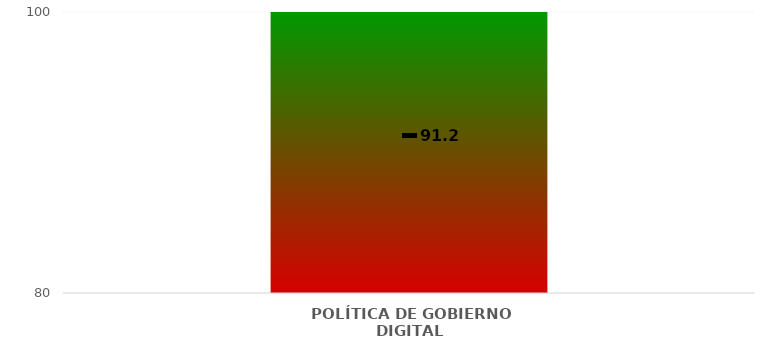
| Category | Niveles |
|---|---|
| POLÍTICA DE GOBIERNO DIGITAL | 100 |